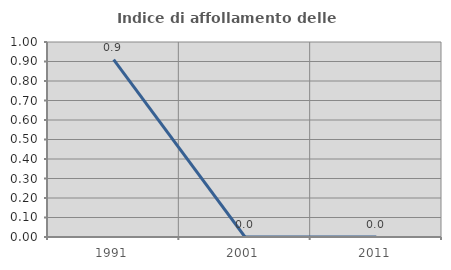
| Category | Indice di affollamento delle abitazioni  |
|---|---|
| 1991.0 | 0.909 |
| 2001.0 | 0 |
| 2011.0 | 0 |